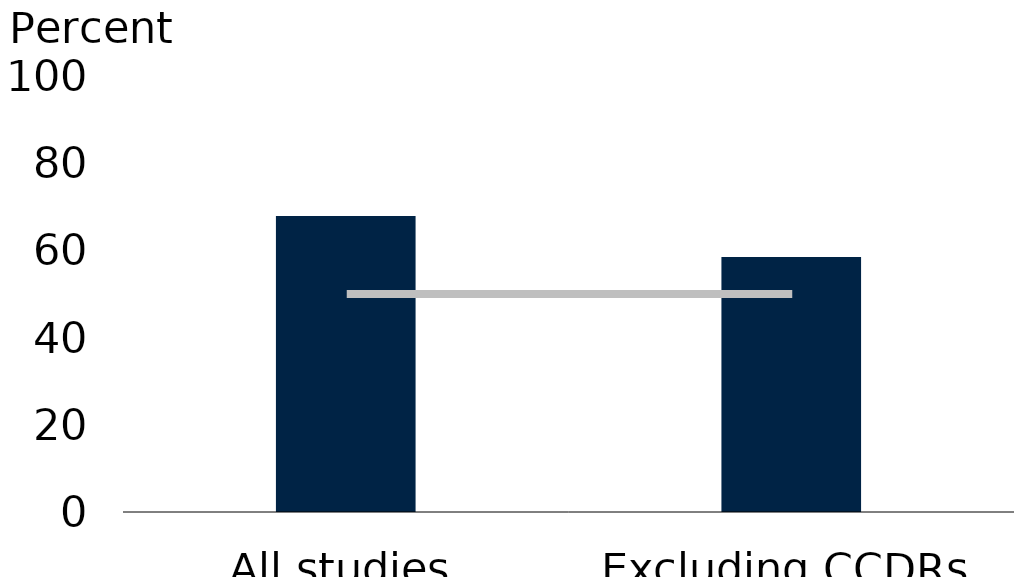
| Category | Series 0 |
|---|---|
| All studies | 67.9 |
| Excluding CCDRs | 58.5 |